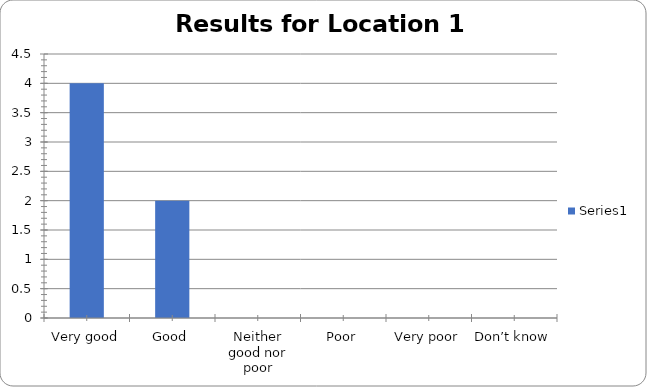
| Category | Series 0 |
|---|---|
| Very good | 4 |
| Good | 2 |
| Neither good nor poor | 0 |
| Poor | 0 |
| Very poor | 0 |
| Don’t know | 0 |